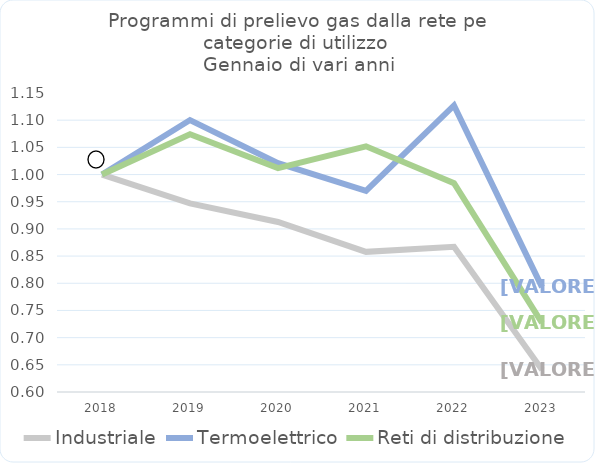
| Category | Industriale | Termoelettrico | Reti di distribuzione |
|---|---|---|---|
| 2018.0 | 1 | 1 | 1 |
| 2019.0 | 0.947 | 1.1 | 1.074 |
| 2020.0 | 0.913 | 1.021 | 1.012 |
| 2021.0 | 0.858 | 0.97 | 1.052 |
| 2022.0 | 0.867 | 1.127 | 0.984 |
| 2023.0 | 0.641 | 0.793 | 0.727 |